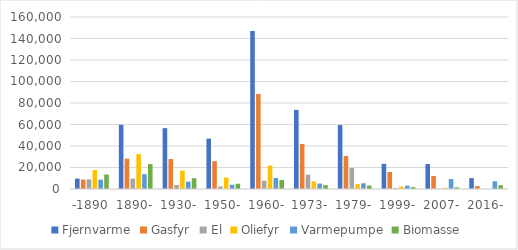
| Category | Fjernvarme | Gasfyr | El | Oliefyr | Varmepumpe | Biomasse |
|---|---|---|---|---|---|---|
| -1890 | 9665 | 8726 | 8987 | 17669 | 8733 | 13454 |
| 1890- | 59743 | 28244 | 9686 | 32488 | 13802 | 23159 |
| 1930- | 56606 | 27831 | 3713 | 17075 | 6891 | 10056 |
| 1950- | 46866 | 25870 | 2415 | 10636 | 3953 | 4910 |
| 1960- | 146975 | 88346 | 7788 | 21837 | 10294 | 8442 |
| 1973- | 73606 | 41866 | 13372 | 7127 | 5044 | 3607 |
| 1979- | 59522 | 30736 | 19560 | 4500 | 5310 | 3187 |
| 1999- | 23349 | 15785 | 974 | 2219 | 3110 | 1754 |
| 2007- | 23210 | 12146 | 290 | 1071 | 9248 | 1593 |
| 2016- | 10103 | 2714 | 44 | 28 | 7219 | 3511 |